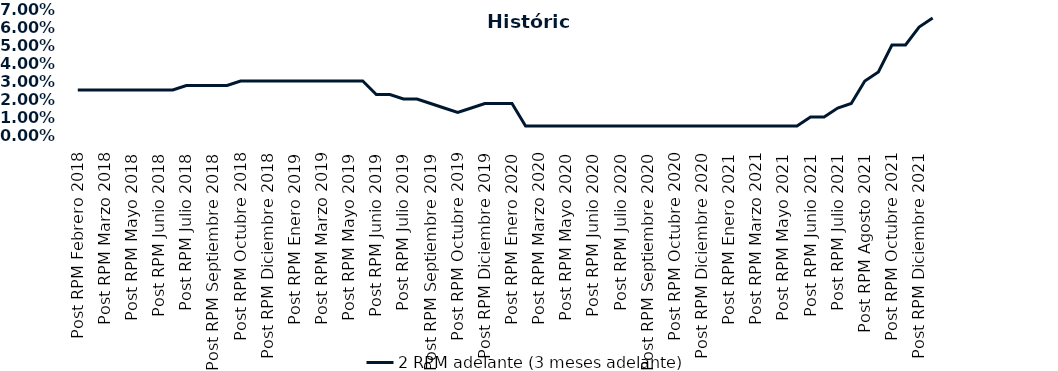
| Category | 2 RPM adelante (3 meses adelante) |
|---|---|
| Post RPM Febrero 2018 | 0.025 |
| Pre RPM Marzo 2018 | 0.025 |
| Post RPM Marzo 2018 | 0.025 |
| Pre RPM Mayo 2018 | 0.025 |
| Post RPM Mayo 2018 | 0.025 |
| Pre RPM Junio 2018 | 0.025 |
| Post RPM Junio 2018 | 0.025 |
| Pre RPM Julio 2018 | 0.025 |
| Post RPM Julio 2018 | 0.028 |
| Pre RPM Septiembre 2018 | 0.028 |
| Post RPM Septiembre 2018 | 0.028 |
| Pre RPM Octubre 2018 | 0.028 |
| Post RPM Octubre 2018 | 0.03 |
| Pre RPM Diciembre 2018 | 0.03 |
| Post RPM Diciembre 2018 | 0.03 |
| Pre RPM Enero 2019 | 0.03 |
| Post RPM Enero 2019 | 0.03 |
| Pre RPM Marzo 2019 | 0.03 |
| Post RPM Marzo 2019 | 0.03 |
| Pre RPM Mayo 2019 | 0.03 |
| Post RPM Mayo 2019 | 0.03 |
| Pre RPM Junio 2019 | 0.03 |
| Post RPM Junio 2019 | 0.022 |
| Pre RPM Julio 2019 | 0.022 |
| Post RPM Julio 2019 | 0.02 |
| Pre RPM Septiembre 2019 | 0.02 |
| Post RPM Septiembre 2019 | 0.018 |
| Pre RPM Octubre 2019 | 0.015 |
| Post RPM Octubre 2019 | 0.012 |
| Pre RPM Diciembre 2019 | 0.015 |
| Post RPM Diciembre 2019 | 0.018 |
| Pre RPM Enero 2020 | 0.018 |
| Post RPM Enero 2020 | 0.018 |
| Pre RPM Marzo 2020 | 0.005 |
| Post RPM Marzo 2020 | 0.005 |
| Pre RPM Mayo 2020 | 0.005 |
| Post RPM Mayo 2020 | 0.005 |
| Pre RPM Junio 2020 | 0.005 |
| Post RPM Junio 2020 | 0.005 |
| Pre RPM Julio 2020 | 0.005 |
| Post RPM Julio 2020 | 0.005 |
| Pre RPM Septiembre 2020 | 0.005 |
| Post RPM Septiembre 2020 | 0.005 |
| Pre RPM Octubre 2020 | 0.005 |
| Post RPM Octubre 2020 | 0.005 |
| Pre RPM Diciembre 2020 | 0.005 |
| Post RPM Diciembre 2020 | 0.005 |
| Pre RPM Enero 2021 | 0.005 |
| Post RPM Enero 2021 | 0.005 |
| Pre RPM Marzo 2021 | 0.005 |
| Post RPM Marzo 2021 | 0.005 |
| Pre RPM Mayo 2021 | 0.005 |
| Post RPM Mayo 2021 | 0.005 |
| Pre RPM Junio 2021 | 0.005 |
| Post RPM Junio 2021 | 0.01 |
| Pre RPM Julio 2021 | 0.01 |
| Post RPM Julio 2021 | 0.015 |
| Pre RPM Agosto 2021 | 0.018 |
| Post RPM Agosto 2021 | 0.03 |
| Pre RPM Octubre 2021 | 0.035 |
| Post RPM Octubre 2021 | 0.05 |
| Pre RPM Diciembre 2021 | 0.05 |
| Post RPM Diciembre 2021 | 0.06 |
| Pre RPM Enero 2022 | 0.065 |